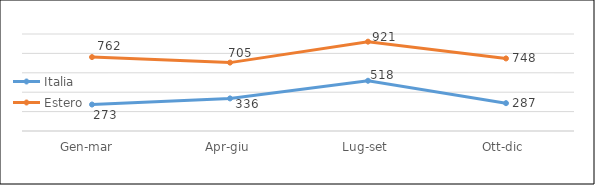
| Category | Italia | Estero |
|---|---|---|
| Gen-mar  | 273 | 762 |
| Apr-giu | 336 | 705 |
| Lug-set | 518 | 921 |
| Ott-dic | 287 | 748 |